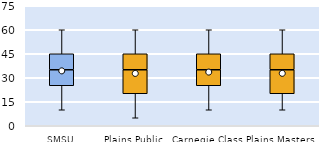
| Category | 25th | 50th | 75th |
|---|---|---|---|
| SMSU | 25 | 10 | 10 |
| Plains Public | 20 | 15 | 10 |
| Carnegie Class | 25 | 10 | 10 |
| Plains Masters | 20 | 15 | 10 |